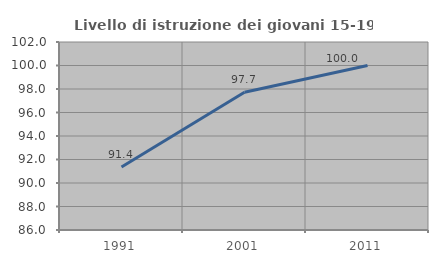
| Category | Livello di istruzione dei giovani 15-19 anni |
|---|---|
| 1991.0 | 91.358 |
| 2001.0 | 97.727 |
| 2011.0 | 100 |